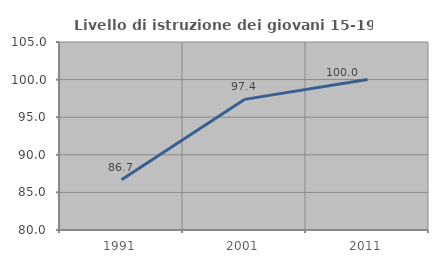
| Category | Livello di istruzione dei giovani 15-19 anni |
|---|---|
| 1991.0 | 86.667 |
| 2001.0 | 97.368 |
| 2011.0 | 100 |